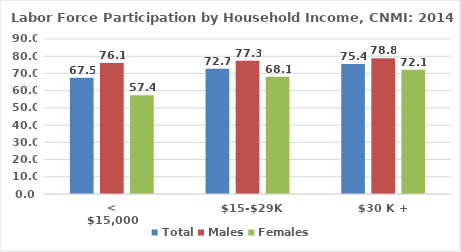
| Category | Total | Males | Females |
|---|---|---|---|
| < $15,000 | 67.526 | 76.095 | 57.359 |
| $15-$29K | 72.703 | 77.307 | 68.089 |
| $30 K + | 75.45 | 78.771 | 72.078 |